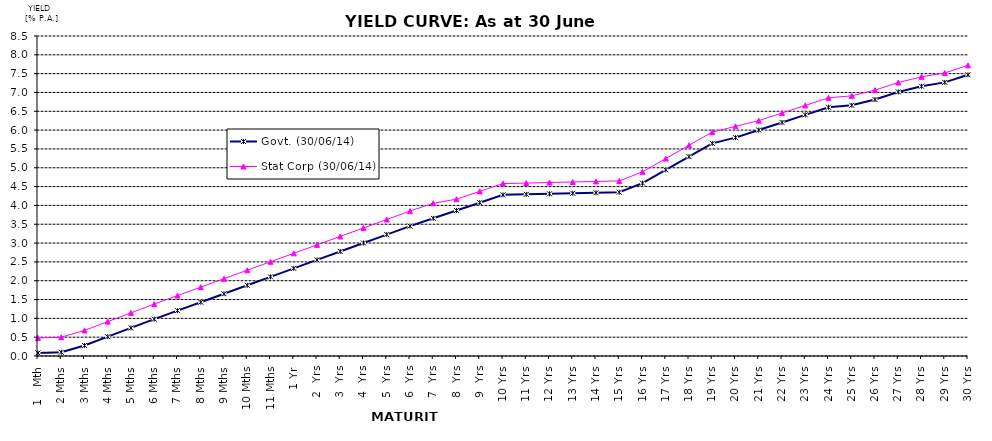
| Category | Govt. (30/06/14) | Stat Corp (30/06/14) | Difference |
|---|---|---|---|
| 1   Mth | 0.08 | 0.48 |  |
| 2 Mths | 0.1 | 0.5 |  |
| 3 Mths | 0.28 | 0.68 |  |
| 4 Mths | 0.513 | 0.913 |  |
| 5 Mths | 0.747 | 1.147 |  |
| 6 Mths | 0.98 | 1.38 |  |
| 7 Mths | 1.205 | 1.605 |  |
| 8 Mths | 1.429 | 1.829 |  |
| 9 Mths | 1.654 | 2.054 |  |
| 10 Mths | 1.878 | 2.278 |  |
| 11 Mths | 2.103 | 2.503 |  |
| 1 Yr | 2.327 | 2.727 |  |
| 2  Yrs | 2.552 | 2.952 |  |
| 3  Yrs | 2.776 | 3.176 |  |
| 4  Yrs | 3.001 | 3.401 |  |
| 5  Yrs | 3.225 | 3.625 |  |
| 6  Yrs | 3.45 | 3.85 |  |
| 7  Yrs | 3.658 | 4.058 |  |
| 8  Yrs | 3.865 | 4.165 |  |
| 9  Yrs | 4.072 | 4.372 |  |
| 10 Yrs | 4.28 | 4.58 |  |
| 11 Yrs | 4.294 | 4.594 |  |
| 12 Yrs | 4.308 | 4.608 |  |
| 13 Yrs | 4.322 | 4.622 |  |
| 14 Yrs | 4.336 | 4.636 |  |
| 15 Yrs | 4.35 | 4.65 |  |
| 16 Yrs | 4.592 | 4.892 |  |
| 17 Yrs | 4.944 | 5.244 |  |
| 18 Yrs | 5.296 | 5.596 |  |
| 19 Yrs | 5.648 | 5.948 |  |
| 20 Yrs | 5.8 | 6.1 |  |
| 21 Yrs | 6.002 | 6.252 |  |
| 22 Yrs | 6.204 | 6.454 |  |
| 23 Yrs | 6.406 | 6.656 |  |
| 24 Yrs | 6.608 | 6.858 |  |
| 25 Yrs | 6.66 | 6.91 |  |
| 26 Yrs | 6.812 | 7.062 |  |
| 27 Yrs | 7.014 | 7.264 |  |
| 28 Yrs | 7.166 | 7.416 |  |
| 29 Yrs | 7.268 | 7.518 |  |
| 30 Yrs | 7.47 | 7.72 |  |